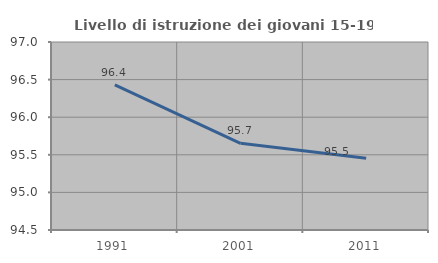
| Category | Livello di istruzione dei giovani 15-19 anni |
|---|---|
| 1991.0 | 96.429 |
| 2001.0 | 95.652 |
| 2011.0 | 95.455 |